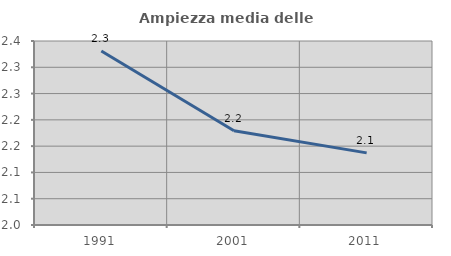
| Category | Ampiezza media delle famiglie |
|---|---|
| 1991.0 | 2.331 |
| 2001.0 | 2.179 |
| 2011.0 | 2.137 |